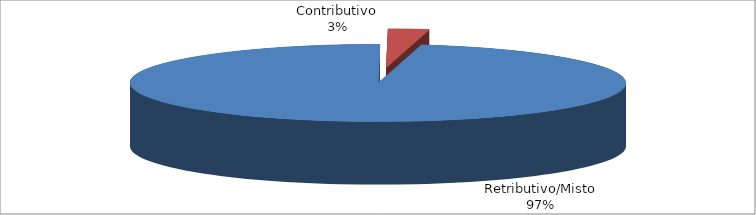
| Category | Decorrenti gennaio - settembre 2022 |
|---|---|
| Retributivo/Misto | 89747 |
| Contributivo | 2455 |